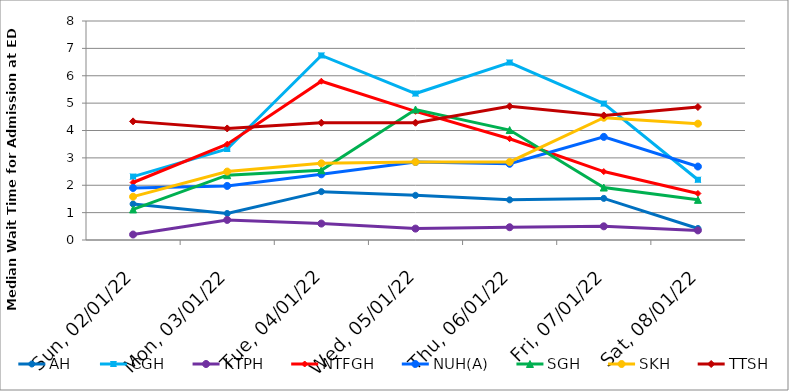
| Category | AH | CGH | KTPH | NTFGH | NUH(A) | SGH | SKH | TTSH |
|---|---|---|---|---|---|---|---|---|
| 2022-01-02 | 1.318 | 2.317 | 0.2 | 2.1 | 1.9 | 1.117 | 1.583 | 4.333 |
| 2022-01-03 | 0.969 | 3.325 | 0.733 | 3.5 | 1.975 | 2.367 | 2.5 | 4.075 |
| 2022-01-04 | 1.767 | 6.742 | 0.6 | 5.8 | 2.4 | 2.55 | 2.8 | 4.283 |
| 2022-01-05 | 1.632 | 5.35 | 0.417 | 4.7 | 2.85 | 4.767 | 2.85 | 4.283 |
| 2022-01-06 | 1.467 | 6.483 | 0.467 | 3.7 | 2.783 | 4.017 | 2.85 | 4.883 |
| 2022-01-07 | 1.52 | 4.983 | 0.5 | 2.5 | 3.767 | 1.917 | 4.467 | 4.55 |
| 2022-01-08 | 0.42 | 2.2 | 0.35 | 1.7 | 2.683 | 1.467 | 4.25 | 4.858 |